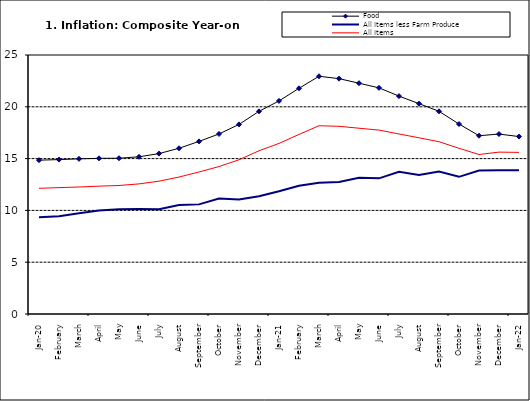
| Category | Food | All Items less Farm Produce | All Items |
|---|---|---|---|
| Jan-20 | 14.849 | 9.349 | 12.132 |
| February | 14.904 | 9.434 | 12.199 |
| March | 14.977 | 9.732 | 12.257 |
| April | 15.026 | 9.979 | 12.341 |
| May | 15.036 | 10.12 | 12.404 |
| June | 15.175 | 10.128 | 12.559 |
| July | 15.482 | 10.102 | 12.821 |
| August | 15.996 | 10.521 | 13.22 |
| September | 16.66 | 10.581 | 13.707 |
| October | 17.378 | 11.137 | 14.233 |
| November | 18.298 | 11.05 | 14.887 |
| December | 19.562 | 11.374 | 15.753 |
| Jan-21 | 20.567 | 11.854 | 16.466 |
| February | 21.786 | 12.382 | 17.335 |
| March | 22.948 | 12.673 | 18.171 |
| April | 22.719 | 12.743 | 18.117 |
| May | 22.277 | 13.145 | 17.933 |
| June | 21.829 | 13.094 | 17.751 |
| July | 21.032 | 13.72 | 17.377 |
| August | 20.303 | 13.408 | 17.009 |
| September | 19.566 | 13.745 | 16.63 |
| October | 18.338 | 13.24 | 15.994 |
| November | 17.209 | 13.851 | 15.396 |
| December | 17.37 | 13.873 | 15.625 |
| Jan-22 | 17.126 | 13.869 | 15.601 |